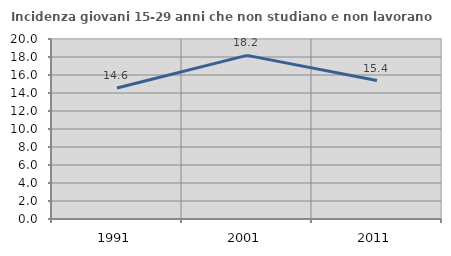
| Category | Incidenza giovani 15-29 anni che non studiano e non lavorano  |
|---|---|
| 1991.0 | 14.563 |
| 2001.0 | 18.182 |
| 2011.0 | 15.385 |